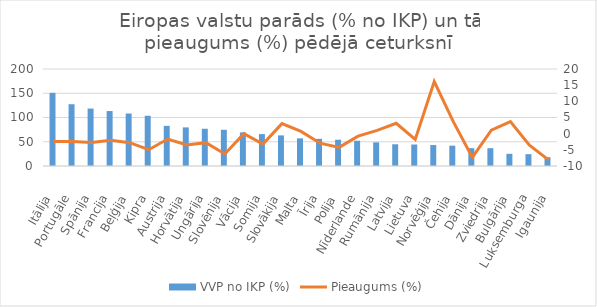
| Category | VVP no IKP (%) |
|---|---|
| Itālija | 150.8 |
| Portugāle | 127.4 |
| Spānija | 118.4 |
| Francija | 113.3 |
|  Beļģija | 108.2 |
| Kipra | 103.6 |
|  Austrija | 82.8 |
| Horvātija | 79.6 |
| Ungārija | 76.8 |
| Slovēnija | 74.7 |
| Vācija | 69.3 |
| Somija | 65.8 |
| Slovākija | 63.1 |
| Malta | 57 |
| Īrija | 56 |
| Polija | 54.2 |
| Nīderlande | 52.1 |
| Rumānija | 48.8 |
| Latvija | 44.8 |
| Lietuva | 44.3 |
| Norvēģija | 43.2 |
|  Čehija | 41.9 |
| Dānija | 36.7 |
| Zviedrija | 36.7 |
|  Bulgārija | 25.1 |
| Luksemburga | 24.4 |
| Igaunija | 18.1 |